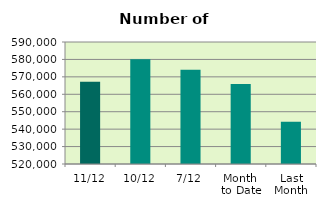
| Category | Series 0 |
|---|---|
| 11/12 | 567246 |
| 10/12 | 580144 |
| 7/12 | 574090 |
| Month 
to Date | 565883.143 |
| Last
Month | 544187.818 |